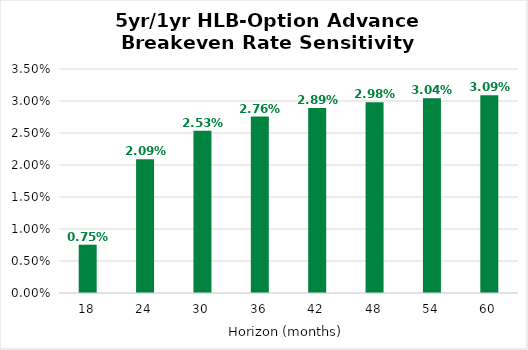
| Category | Breakeven Rate |
|---|---|
| 18.0 | 0.008 |
| 24.0 | 0.021 |
| 30.0 | 0.025 |
| 36.0 | 0.028 |
| 42.0 | 0.029 |
| 48.0 | 0.03 |
| 54.0 | 0.03 |
| 60.0 | 0.031 |